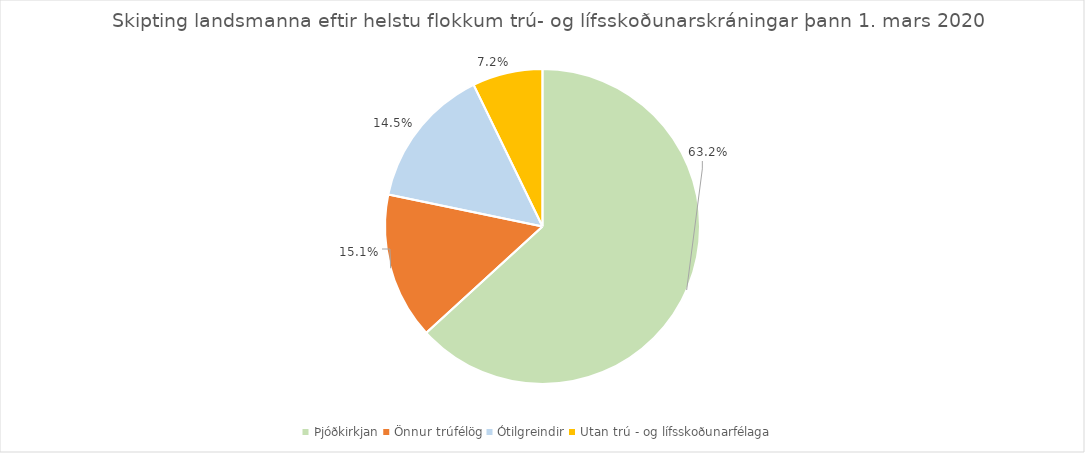
| Category | Series 0 |
|---|---|
| Þjóðkirkjan | 0.632 |
| Önnur trúfélög | 0.151 |
| Ótilgreindir | 0.145 |
| Utan trú - og lífsskoðunarfélaga | 0.072 |